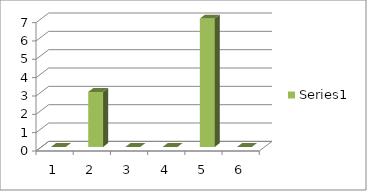
| Category | Series 0 |
|---|---|
| 0 | 0 |
| 1 | 3 |
| 2 | 0 |
| 3 | 0 |
| 4 | 7 |
| 5 | 0 |